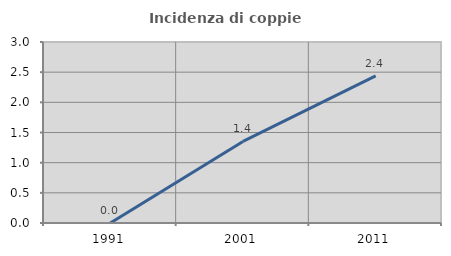
| Category | Incidenza di coppie miste |
|---|---|
| 1991.0 | 0 |
| 2001.0 | 1.351 |
| 2011.0 | 2.439 |